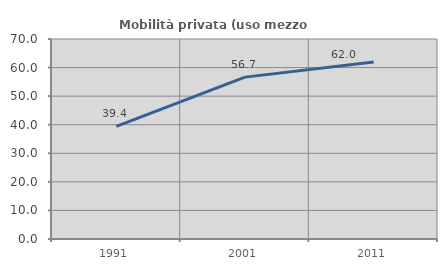
| Category | Mobilità privata (uso mezzo privato) |
|---|---|
| 1991.0 | 39.427 |
| 2001.0 | 56.658 |
| 2011.0 | 61.96 |